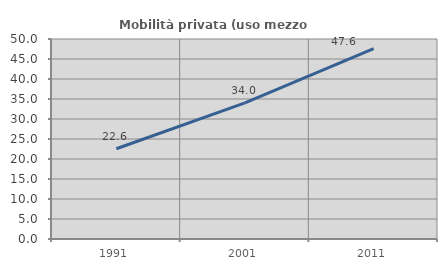
| Category | Mobilità privata (uso mezzo privato) |
|---|---|
| 1991.0 | 22.564 |
| 2001.0 | 34.036 |
| 2011.0 | 47.592 |